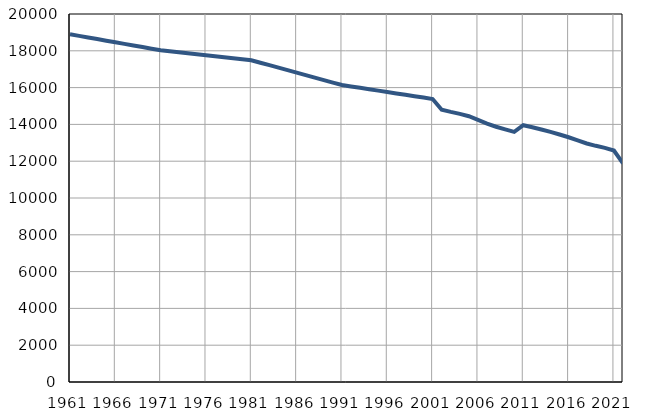
| Category | Број
становника |
|---|---|
| 1961.0 | 18899 |
| 1962.0 | 18812 |
| 1963.0 | 18725 |
| 1964.0 | 18637 |
| 1965.0 | 18550 |
| 1966.0 | 18463 |
| 1967.0 | 18376 |
| 1968.0 | 18289 |
| 1969.0 | 18202 |
| 1970.0 | 18115 |
| 1971.0 | 18028 |
| 1972.0 | 17974 |
| 1973.0 | 17920 |
| 1974.0 | 17866 |
| 1975.0 | 17812 |
| 1976.0 | 17759 |
| 1977.0 | 17706 |
| 1978.0 | 17651 |
| 1979.0 | 17597 |
| 1980.0 | 17543 |
| 1981.0 | 17489 |
| 1982.0 | 17353 |
| 1983.0 | 17219 |
| 1984.0 | 17084 |
| 1985.0 | 16949 |
| 1986.0 | 16814 |
| 1987.0 | 16679 |
| 1988.0 | 16544 |
| 1989.0 | 16409 |
| 1990.0 | 16274 |
| 1991.0 | 16139 |
| 1992.0 | 16063 |
| 1993.0 | 15987 |
| 1994.0 | 15912 |
| 1995.0 | 15836 |
| 1996.0 | 15760 |
| 1997.0 | 15684 |
| 1998.0 | 15609 |
| 1999.0 | 15532 |
| 2000.0 | 15457 |
| 2001.0 | 15381 |
| 2002.0 | 14800 |
| 2003.0 | 14680 |
| 2004.0 | 14572 |
| 2005.0 | 14442 |
| 2006.0 | 14244 |
| 2007.0 | 14042 |
| 2008.0 | 13872 |
| 2009.0 | 13731 |
| 2010.0 | 13596 |
| 2011.0 | 13954 |
| 2012.0 | 13848 |
| 2013.0 | 13721 |
| 2014.0 | 13594 |
| 2015.0 | 13449 |
| 2016.0 | 13301 |
| 2017.0 | 13130 |
| 2018.0 | 12963 |
| 2019.0 | 12836 |
| 2020.0 | 12724 |
| 2021.0 | 12582 |
| 2022.0 | 11881 |